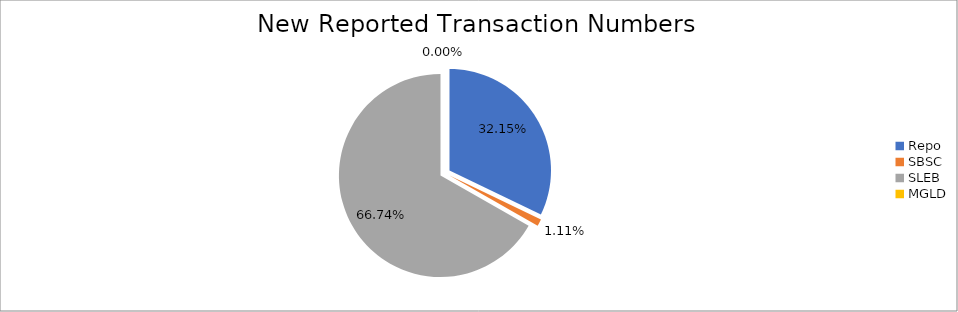
| Category | Series 0 |
|---|---|
| Repo | 339996 |
| SBSC | 11701 |
| SLEB | 705822 |
| MGLD | 24 |